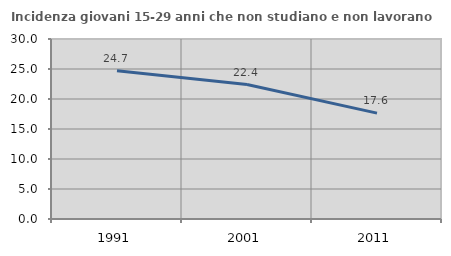
| Category | Incidenza giovani 15-29 anni che non studiano e non lavorano  |
|---|---|
| 1991.0 | 24.691 |
| 2001.0 | 22.414 |
| 2011.0 | 17.647 |